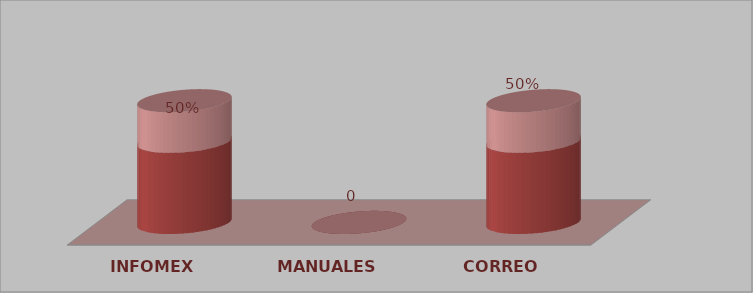
| Category | Series 0 | Series 1 |
|---|---|---|
| INFOMEX | 1 | 0.5 |
| MANUALES | 0 | 0 |
| CORREO | 1 | 0.5 |